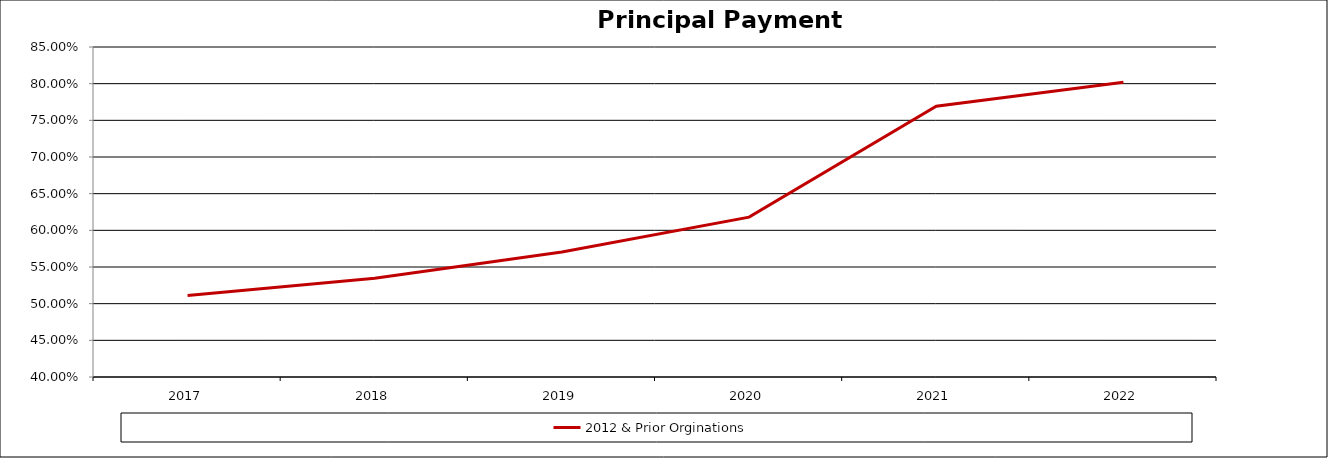
| Category | 2012 & Prior Orginations  |
|---|---|
| 2017.0 | 0.511 |
| 2018.0 | 0.535 |
| 2019.0 | 0.57 |
| 2020.0 | 0.618 |
| 2021.0 | 0.769 |
| 2022.0 | 0.802 |